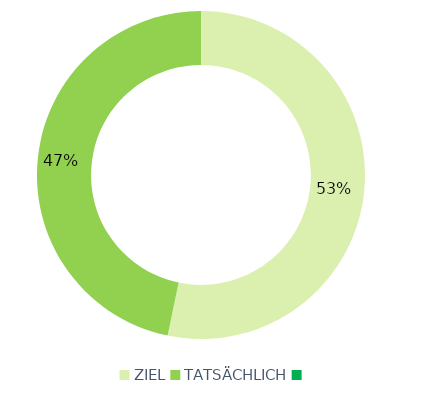
| Category | Series 0 |
|---|---|
| ZIEL | 245 |
| TATSÄCHLICH | 215 |